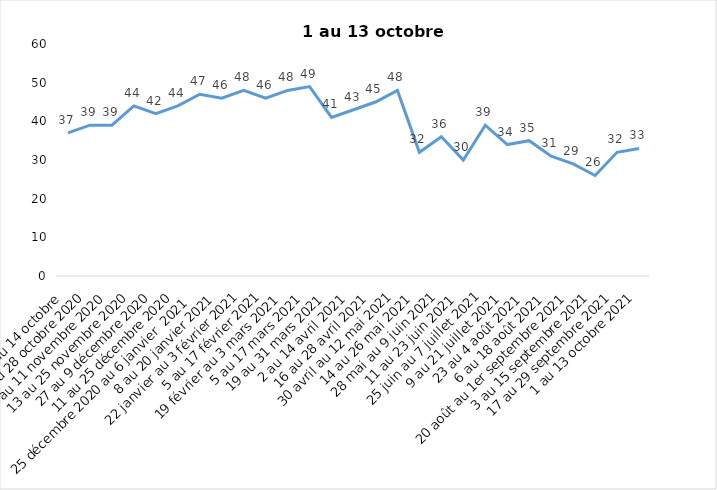
| Category | Toujours aux trois mesures |
|---|---|
| 2 au 14 octobre  | 37 |
| 16 au 28 octobre 2020 | 39 |
| 30 octobre au 11 novembre 2020 | 39 |
| 13 au 25 novembre 2020 | 44 |
| 27 au 9 décembre 2020 | 42 |
| 11 au 25 décembre 2020 | 44 |
| 25 décembre 2020 au 6 janvier  2021 | 47 |
| 8 au 20 janvier 2021 | 46 |
| 22 janvier au 3 février 2021 | 48 |
| 5 au 17 février 2021 | 46 |
| 19 février au 3 mars 2021 | 48 |
| 5 au 17 mars 2021 | 49 |
| 19 au 31 mars 2021 | 41 |
| 2 au 14 avril 2021 | 43 |
| 16 au 28 avril 2021 | 45 |
| 30 avril au 12 mai 2021 | 48 |
| 14 au 26 mai 2021 | 32 |
| 28 mai au 9 juin 2021 | 36 |
| 11 au 23 juin 2021 | 30 |
| 25 juin au 7 juillet 2021 | 39 |
| 9 au 21 juillet 2021 | 34 |
| 23 au 4 août 2021 | 35 |
| 6 au 18 août 2021 | 31 |
| 20 août au 1er septembre 2021 | 29 |
| 3 au 15 septembre 2021 | 26 |
| 17 au 29 septembre 2021 | 32 |
| 1 au 13 octobre 2021 | 33 |